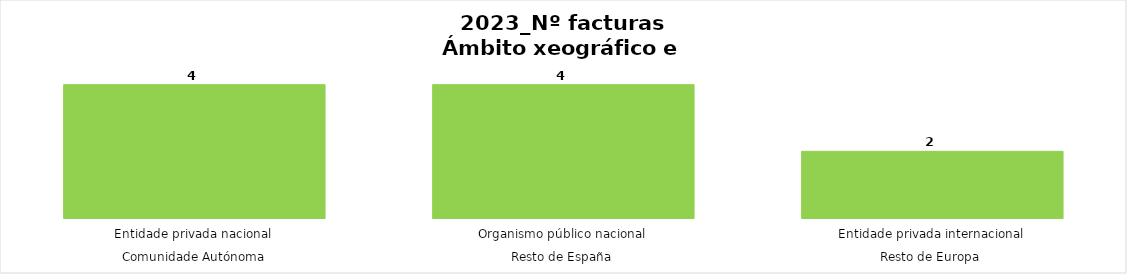
| Category | Series 0 |
|---|---|
| 0 | 4 |
| 1 | 4 |
| 2 | 2 |